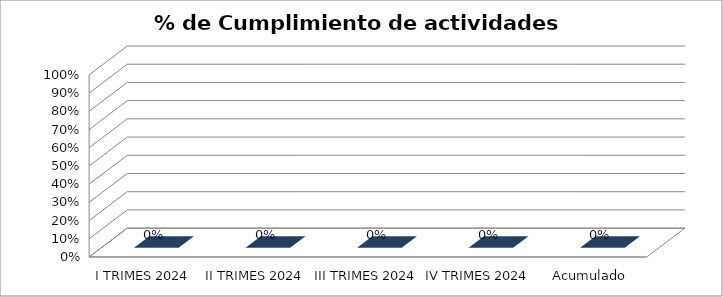
| Category | % de cumplimiento  |
|---|---|
| I TRIMES 2024 | 0 |
| II TRIMES 2024 | 0 |
| III TRIMES 2024 | 0 |
| IV TRIMES 2024 | 0 |
| Acumulado | 0 |